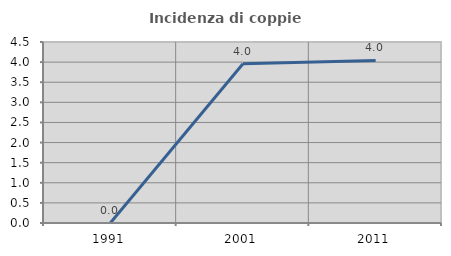
| Category | Incidenza di coppie miste |
|---|---|
| 1991.0 | 0 |
| 2001.0 | 3.96 |
| 2011.0 | 4.04 |